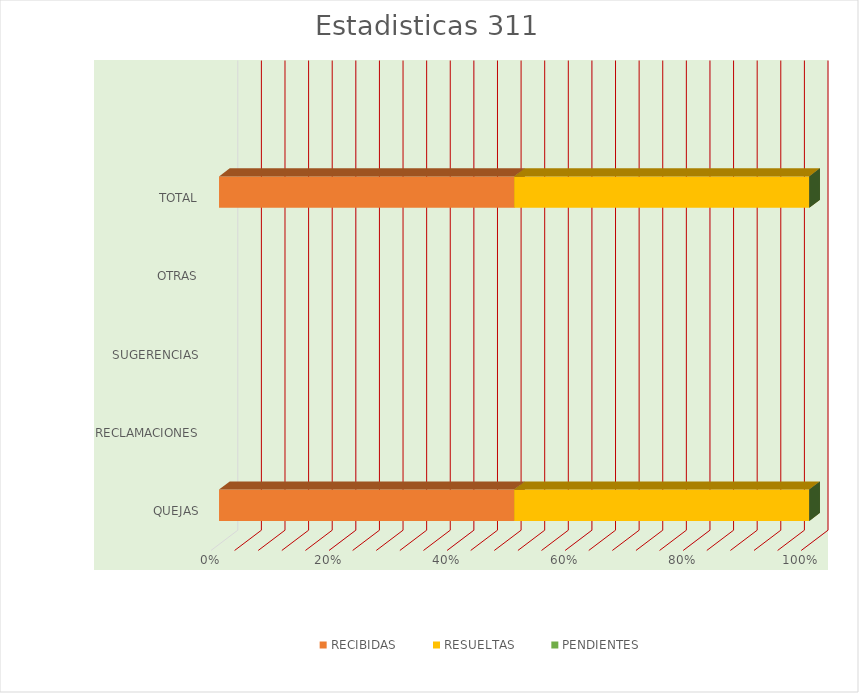
| Category | RECIBIDAS | RESUELTAS | PENDIENTES |
|---|---|---|---|
| QUEJAS | 1 | 1 | 0 |
| RECLAMACIONES | 0 | 0 | 0 |
| SUGERENCIAS | 0 | 0 | 0 |
| OTRAS | 0 | 0 | 0 |
| TOTAL | 1 | 1 | 0 |